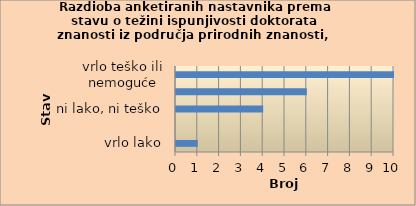
| Category | Series 0 |
|---|---|
| vrlo lako | 1 |
| lako | 0 |
| ni lako, ni teško | 4 |
| teško | 6 |
| vrlo teško ili nemoguće | 10 |